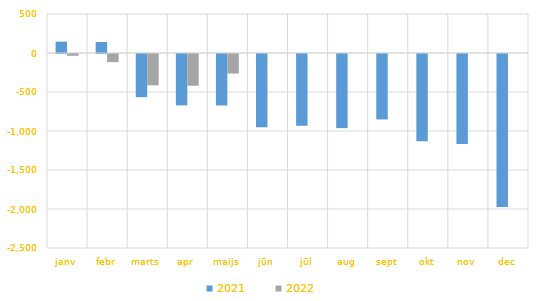
| Category | 2021 | 2022 |
|---|---|---|
| janv | 145495.451 | -22576.613 |
| febr | 140973.019 | -104207.657 |
| marts | -553552.963 | -401343.883 |
| apr | -658430.761 | -406432.786 |
| maijs | -659587.172 | -250383.143 |
| jūn | -939419.413 | 0 |
| jūl | -920391.102 | 0 |
| aug | -950438.335 | 0 |
| sept | -838941.258 | 0 |
| okt | -1117742.949 | 0 |
| nov | -1155026.676 | 0 |
| dec | -1960876.794 | 0 |